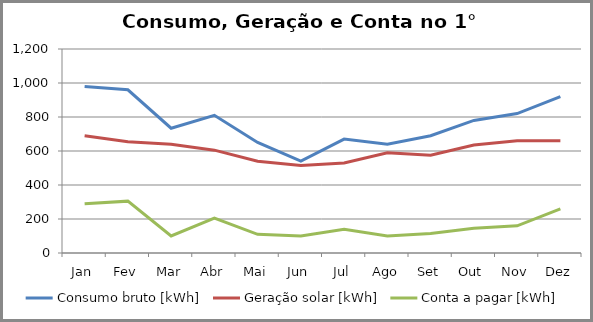
| Category | Consumo bruto [kWh] | Geração solar [kWh] | Conta a pagar [kWh] |
|---|---|---|---|
| Jan | 980 | 690 | 290 |
| Fev | 960 | 655 | 305 |
| Mar | 734 | 640 | 100 |
| Abr | 810 | 605 | 205 |
| Mai | 650 | 540 | 110 |
| Jun | 540 | 515 | 100 |
| Jul | 670 | 530 | 140 |
| Ago | 640 | 590 | 100 |
| Set | 690 | 575 | 115 |
| Out | 780 | 635 | 145 |
| Nov | 820 | 660 | 160 |
| Dez | 920 | 660 | 260 |